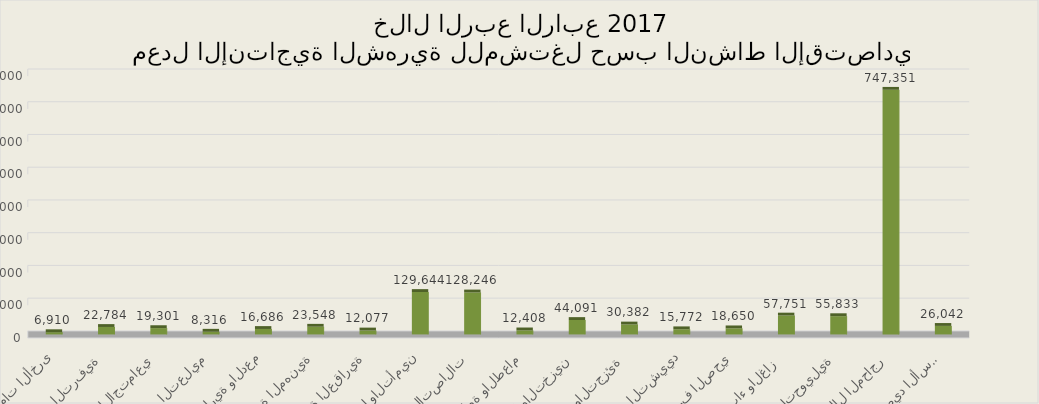
| Category | إنتاجية المشتغل  |
|---|---|
| الزراعة والحراجة وصيد الأسماك | 26042 |
| التعدين واستغلال المحاجر | 747351 |
| الصناعة التحويلية | 55833 |
| توصيل الكهرباء والغاز  | 57751 |
| امدادات الماء والصرف الصحي | 18650 |
| التشييد | 15772 |
| تجارة الجملة والتجزئة | 30382 |
| النقل والتخزين | 44091 |
| الإقامة والطعام | 12408 |
| المعلومات والاتصالات | 128246 |
| أنشطة المال والتأمين | 129644 |
| الأنشطة العقارية | 12077 |
| الأنشطة المهنية  | 23548 |
| الخدمات الإدارية والدعم | 16686 |
| التعليم | 8316 |
| الصحة والعمل الاجتماعي | 19301 |
| الفنون والترفية | 22784 |
| الخدمات الأخرى | 6910 |